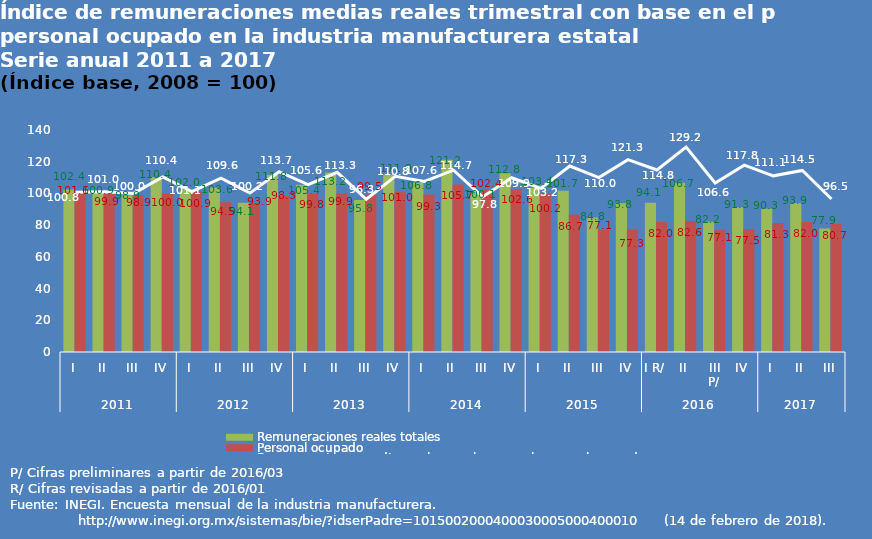
| Category | Remuneraciones reales totales | Personal ocupado |
|---|---|---|
| 0 | 102.4 | 101.6 |
| 1 | 100.9 | 99.9 |
| 2 | 98.9 | 98.9 |
| 3 | 110.4 | 100 |
| 4 | 102 | 100.9 |
| 5 | 103.6 | 94.5 |
| 6 | 94.1 | 93.9 |
| 7 | 111.8 | 98.3 |
| 8 | 105.4 | 99.8 |
| 9 | 113.2 | 99.9 |
| 10 | 95.8 | 99.5 |
| 11 | 111.9 | 101 |
| 12 | 106.8 | 99.3 |
| 13 | 121.2 | 105.7 |
| 14 | 100.1 | 102.4 |
| 15 | 112.8 | 102.6 |
| 16 | 103.4 | 100.2 |
| 17 | 101.7 | 86.7 |
| 18 | 84.8 | 77.1 |
| 19 | 93.8 | 77.3 |
| 20 | 94.1 | 82 |
| 21 | 106.7 | 82.6 |
| 22 | 82.2 | 77.1 |
| 23 | 91.3 | 77.5 |
| 24 | 90.3 | 81.3 |
| 25 | 93.9 | 82 |
| 26 | 77.9 | 80.7 |